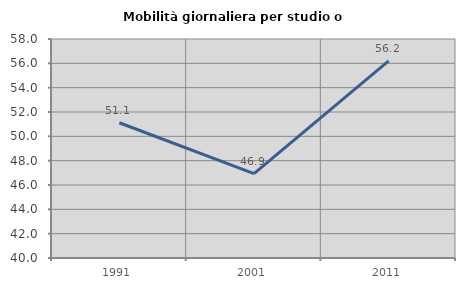
| Category | Mobilità giornaliera per studio o lavoro |
|---|---|
| 1991.0 | 51.117 |
| 2001.0 | 46.936 |
| 2011.0 | 56.199 |